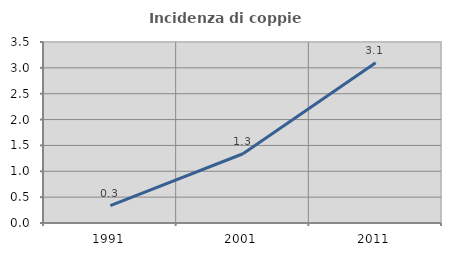
| Category | Incidenza di coppie miste |
|---|---|
| 1991.0 | 0.336 |
| 2001.0 | 1.339 |
| 2011.0 | 3.1 |